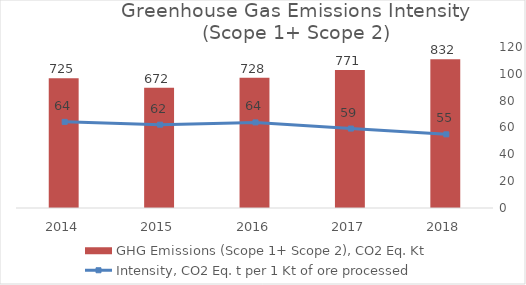
| Category | GHG Emissions (Scope 1+ Scope 2), CO2 Eq. Kt |
|---|---|
| 2014.0 | 725 |
| 2015.0 | 672 |
| 2016.0 | 728 |
| 2017.0 | 771 |
| 2018.0 | 832 |